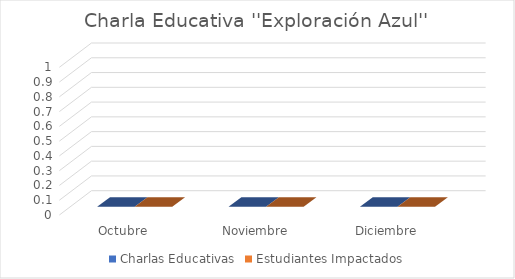
| Category | Charlas Educativas | Estudiantes Impactados |
|---|---|---|
| Octubre | 0 | 0 |
| Noviembre | 0 | 0 |
| Diciembre | 0 | 0 |